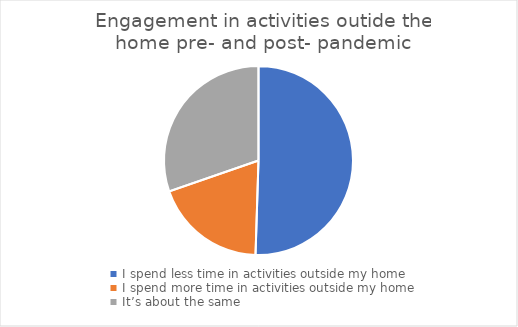
| Category | Series 0 |
|---|---|
| I spend less time in activities outside my home | 50 |
| I spend more time in activities outside my home | 19 |
| It’s about the same | 30 |